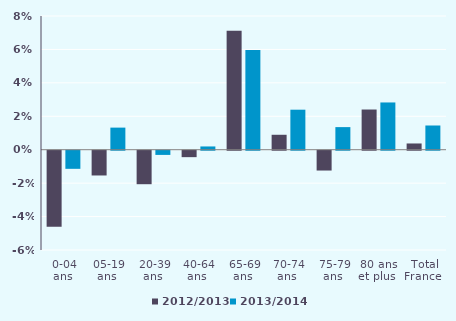
| Category | 2012/2013 | 2013/2014 |
|---|---|---|
| 0-04 ans  | -0.045 | -0.011 |
| 05-19 ans  | -0.015 | 0.013 |
| 20-39 ans  | -0.02 | -0.003 |
| 40-64 ans  | -0.004 | 0.002 |
| 65-69 ans  | 0.071 | 0.06 |
| 70-74 ans  | 0.009 | 0.024 |
| 75-79 ans  | -0.012 | 0.014 |
| 80 ans et plus  | 0.024 | 0.028 |
| Total France  | 0.004 | 0.014 |